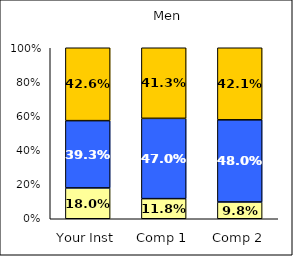
| Category | Low Faculty Interaction | Average Faculty Interaction | High Faculty Interaction |
|---|---|---|---|
| Your Inst | 0.18 | 0.393 | 0.426 |
| Comp 1 | 0.118 | 0.47 | 0.413 |
| Comp 2 | 0.098 | 0.48 | 0.421 |